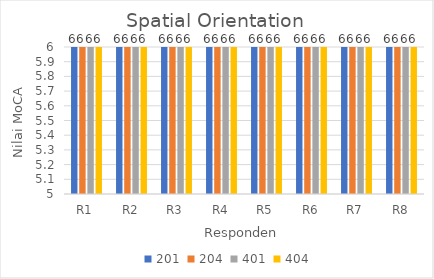
| Category | 201 | 204 | 401 | 404 |
|---|---|---|---|---|
| R1 | 6 | 6 | 6 | 6 |
| R2 | 6 | 6 | 6 | 6 |
| R3 | 6 | 6 | 6 | 6 |
| R4 | 6 | 6 | 6 | 6 |
| R5 | 6 | 6 | 6 | 6 |
| R6 | 6 | 6 | 6 | 6 |
| R7 | 6 | 6 | 6 | 6 |
| R8 | 6 | 6 | 6 | 6 |